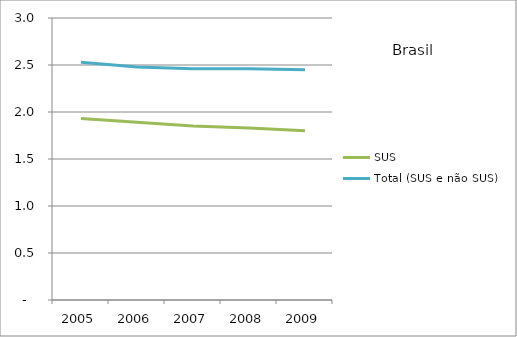
| Category | SUS | Total (SUS e não SUS) |
|---|---|---|
| 2005.0 | 1.93 | 2.53 |
| 2006.0 | 1.89 | 2.48 |
| 2007.0 | 1.85 | 2.46 |
| 2008.0 | 1.83 | 2.46 |
| 2009.0 | 1.8 | 2.45 |